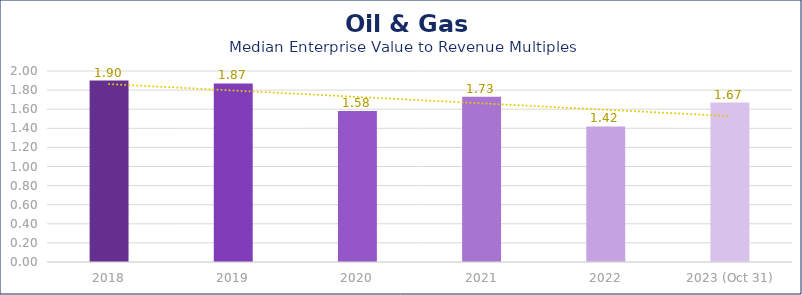
| Category | Oil & Gas |
|---|---|
| 2018 | 1.9 |
| 2019 | 1.87 |
| 2020 | 1.58 |
| 2021 | 1.73 |
| 2022 | 1.42 |
| 2023 (Oct 31) | 1.67 |